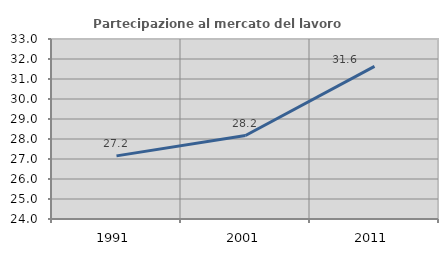
| Category | Partecipazione al mercato del lavoro  femminile |
|---|---|
| 1991.0 | 27.156 |
| 2001.0 | 28.173 |
| 2011.0 | 31.629 |